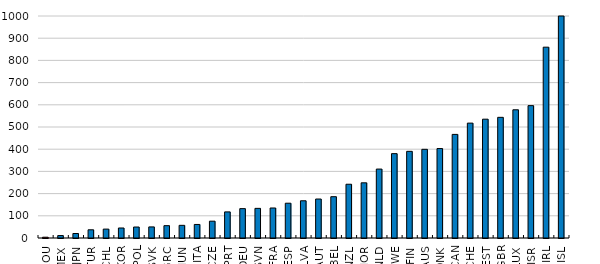
| Category | Series 0 |
|---|---|
| ROU | 3.543 |
| MEX | 10.983 |
| JPN | 20.24 |
| TUR | 36.953 |
| CHL | 40.098 |
| KOR | 45.085 |
| POL | 49.449 |
| SVK | 49.936 |
| GRC | 55.557 |
| HUN | 57.018 |
| ITA | 60.978 |
| CZE | 75.76 |
| PRT | 117.587 |
| DEU | 132.32 |
| SVN | 133.503 |
| FRA | 135.19 |
| ESP | 156.708 |
| LVA | 167.658 |
| AUT | 175.539 |
| BEL | 186.043 |
| NZL | 242.145 |
| NOR | 248.573 |
| NLD | 310.487 |
| SWE | 379.94 |
| FIN | 390.355 |
| AUS | 399.442 |
| DNK | 402.936 |
| CAN | 466.69 |
| CHE | 517.463 |
| EST | 535.248 |
| GBR | 543.534 |
| LUX | 577.561 |
| ISR | 596.254 |
| IRL | 859.585 |
| ISL | 1165.244 |